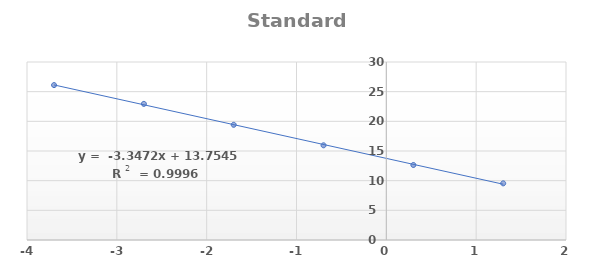
| Category | Standard Curve |
|---|---|
| 1.3010299956639813 | 9.547 |
| 0.3010299956639812 | 12.64 |
| -0.6989700043360187 | 15.96 |
| -1.6989700043360187 | 19.413 |
| -2.6989700043360187 | 22.94 |
| -3.6989700043360187 | 26.107 |